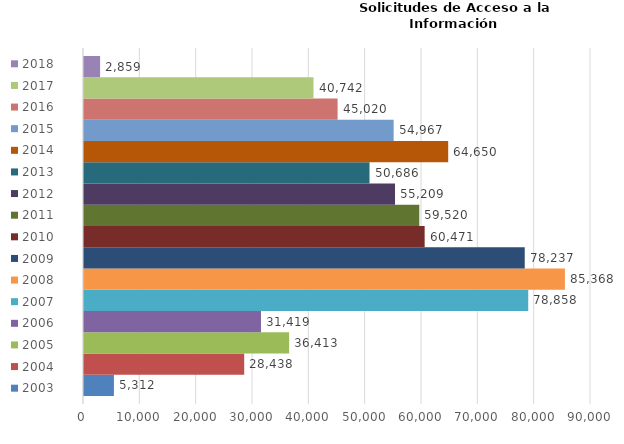
| Category | 2003 | 2004 | 2005 | 2006 | 2007 | 2008 | 2009 | 2010 | 2011 | 2012 | 2013 | 2014 | 2015 | 2016 | 2017 | 2018 |
|---|---|---|---|---|---|---|---|---|---|---|---|---|---|---|---|---|
| 0 | 5312 | 28438 | 36413 | 31419 | 78858 | 85368 | 78237 | 60471 | 59520 | 55209 | 50686 | 64650 | 54967 | 45020 | 40742 | 2859 |